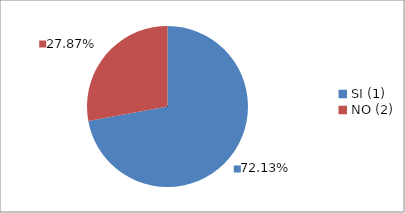
| Category | Series 0 |
|---|---|
| SI (1) | 0.721 |
| NO (2) | 0.279 |